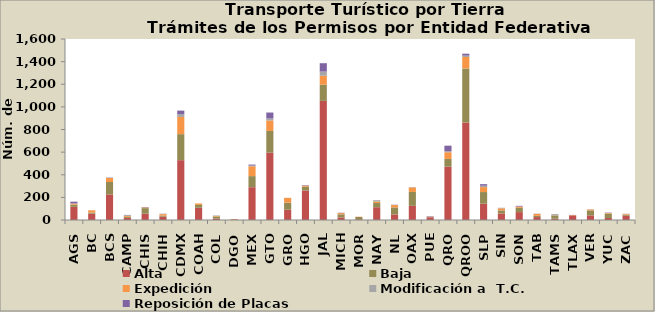
| Category | Alta                                         | Baja | Expedición | Modificación a  T.C. | Reposición de Placas | Otros |
|---|---|---|---|---|---|---|
| AGS | 116 | 20 | 9 | 1 | 16 |  |
| BC | 56 | 10 | 20 | 0 | 0 |  |
| BCS | 226 | 110 | 35 | 3 | 2 |  |
| CAMP | 19 | 9 | 8 | 7 | 2 |  |
| CHIS | 56 | 49 | 6 | 1 | 3 |  |
| CHIH | 30 | 9 | 13 | 1 | 2 |  |
| CDMX | 529 | 230 | 152 | 25 | 31 |  |
| COAH | 108 | 25 | 13 | 0 | 0 |  |
| COL | 12 | 19 | 5 | 3 | 1 |  |
| DGO | 6 | 0 | 3 | 0 | 0 |  |
| MEX | 290 | 98 | 87 | 6 | 9 |  |
| GTO | 595 | 192 | 93 | 17 | 53 |  |
| GRO | 91 | 62 | 43 | 0 | 0 |  |
| HGO | 261 | 34 | 9 | 0 | 4 |  |
| JAL | 1053 | 143 | 79 | 37 | 74 |  |
| MICH | 23 | 27 | 11 | 0 | 3 |  |
| MOR | 7 | 20 | 2 | 0 | 0 |  |
| NAY | 113 | 37 | 13 | 12 | 0 |  |
| NL | 49 | 62 | 21 | 1 | 2 |  |
| OAX | 125 | 123 | 40 | 3 | 0 |  |
| PUE | 24 | 2 | 3 | 0 | 4 |  |
| QRO | 472 | 68 | 59 | 10 | 48 |  |
| QROO | 862 | 477 | 102 | 12 | 17 |  |
| SLP | 144 | 103 | 44 | 12 | 14 |  |
| SIN | 58 | 27 | 18 | 5 | 0 |  |
| SON | 70 | 38 | 11 | 0 | 6 |  |
| TAB | 26 | 11 | 17 | 1 | 1 |  |
| TAMS | 12 | 28 | 2 | 10 | 0 |  |
| TLAX | 41 | 1 | 2 | 0 | 1 |  |
| VER | 41 | 44 | 8 | 0 | 1 |  |
| YUC | 18 | 39 | 5 | 0 | 3 |  |
| ZAC | 38 | 10 | 6 | 0 | 1 |  |